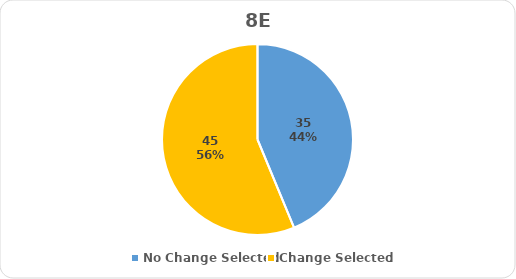
| Category | Series 0 |
|---|---|
| No Change Selected | 35 |
| Change Selected | 45 |